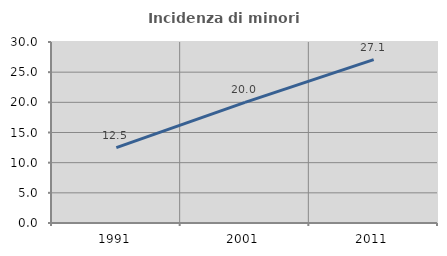
| Category | Incidenza di minori stranieri |
|---|---|
| 1991.0 | 12.5 |
| 2001.0 | 20 |
| 2011.0 | 27.083 |